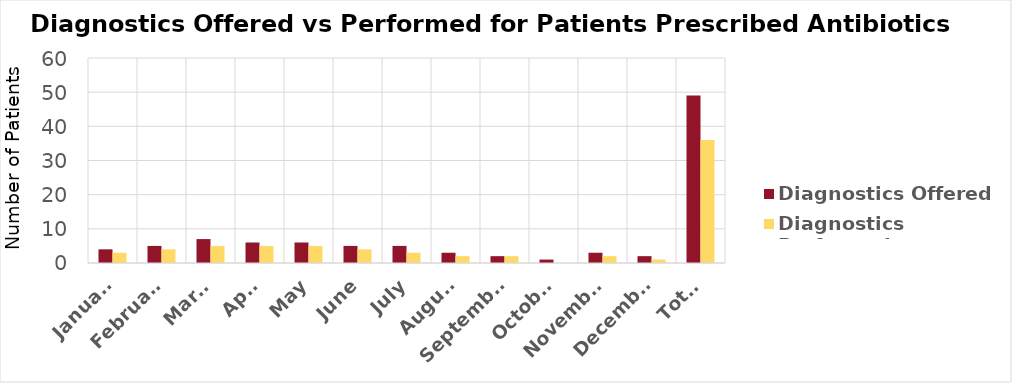
| Category | Diagnostics Offered | Diagnostics Performed |
|---|---|---|
| January | 4 | 3 |
| February | 5 | 4 |
| March | 7 | 5 |
| April | 6 | 5 |
| May | 6 | 5 |
| June | 5 | 4 |
| July | 5 | 3 |
| August | 3 | 2 |
| September | 2 | 2 |
| October | 1 | 0 |
| November | 3 | 2 |
| December | 2 | 1 |
| Total | 49 | 36 |